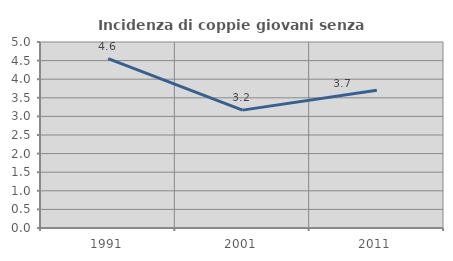
| Category | Incidenza di coppie giovani senza figli |
|---|---|
| 1991.0 | 4.554 |
| 2001.0 | 3.168 |
| 2011.0 | 3.704 |